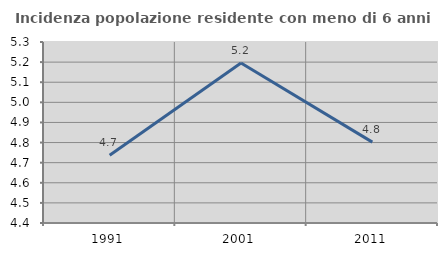
| Category | Incidenza popolazione residente con meno di 6 anni |
|---|---|
| 1991.0 | 4.736 |
| 2001.0 | 5.195 |
| 2011.0 | 4.802 |